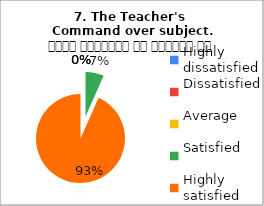
| Category | 7. The Teacher's 
Command over subject. विषय अवधारणा पर शिक्षक का ज्ञान |
|---|---|
| Highly dissatisfied | 0 |
| Dissatisfied | 0 |
| Average | 0 |
| Satisfied | 1 |
| Highly satisfied | 14 |